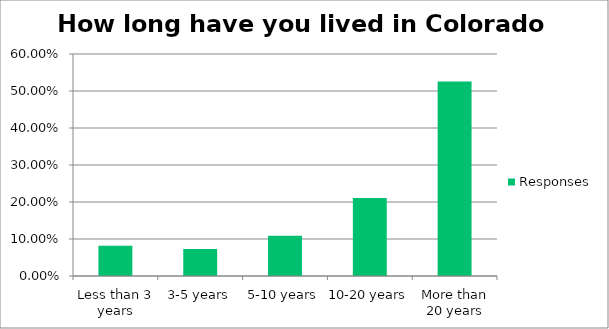
| Category | Responses |
|---|---|
| Less than 3 years | 0.082 |
| 3-5 years | 0.073 |
| 5-10 years | 0.109 |
| 10-20 years | 0.211 |
| More than 20 years | 0.525 |